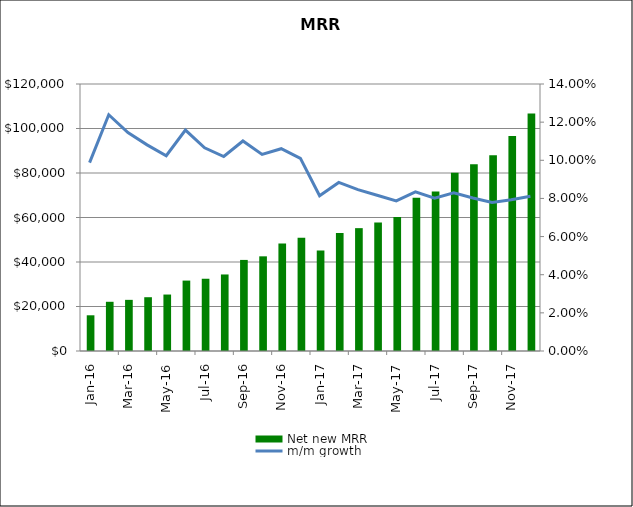
| Category | Net new MRR |
|---|---|
| 2016-01-01 | 16050 |
| 2016-02-01 | 22117.75 |
| 2016-03-01 | 22986.509 |
| 2016-04-01 | 24172.365 |
| 2016-05-01 | 25375.488 |
| 2016-06-01 | 31647.311 |
| 2016-07-01 | 32473.843 |
| 2016-08-01 | 34399.287 |
| 2016-09-01 | 40936.476 |
| 2016-10-01 | 42548.023 |
| 2016-11-01 | 48287.746 |
| 2016-12-01 | 50844.634 |
| 2017-01-01 | 45120.015 |
| 2017-02-01 | 52981.329 |
| 2017-03-01 | 55215.5 |
| 2017-04-01 | 57804.599 |
| 2017-05-01 | 60268.021 |
| 2017-06-01 | 68864.818 |
| 2017-07-01 | 71677.463 |
| 2017-08-01 | 80134.314 |
| 2017-09-01 | 83971.627 |
| 2017-10-01 | 88029.948 |
| 2017-11-01 | 96645.748 |
| 2017-12-01 | 106716.83 |